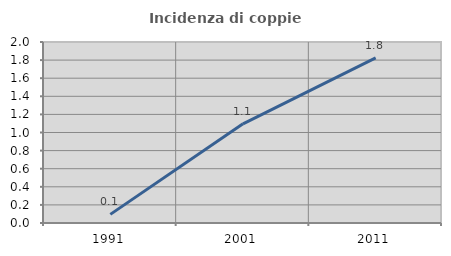
| Category | Incidenza di coppie miste |
|---|---|
| 1991.0 | 0.095 |
| 2001.0 | 1.096 |
| 2011.0 | 1.825 |